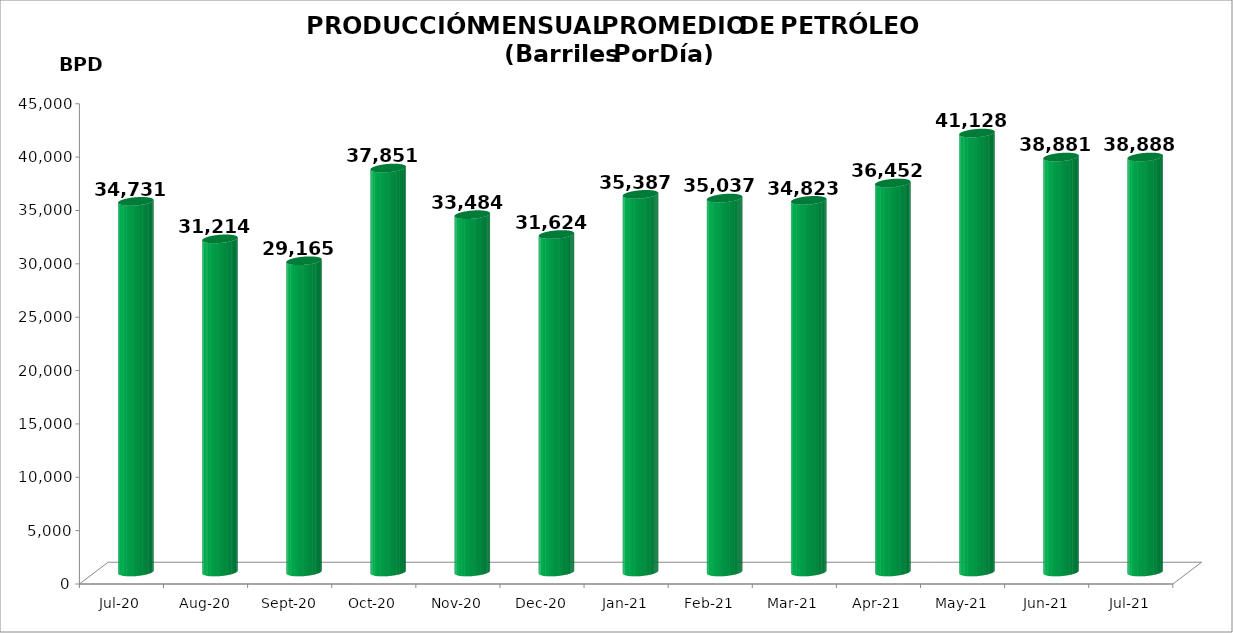
| Category | Series 0 |
|---|---|
| 2020-07-01 | 34731 |
| 2020-08-01 | 31214 |
| 2020-09-01 | 29165 |
| 2020-10-01 | 37851 |
| 2020-11-01 | 33484 |
| 2020-12-01 | 31624 |
| 2021-01-01 | 35387 |
| 2021-02-01 | 35037 |
| 2021-03-01 | 34823 |
| 2021-04-01 | 36452 |
| 2021-05-01 | 41128.032 |
| 2021-06-01 | 38881.4 |
| 2021-07-01 | 38887.645 |